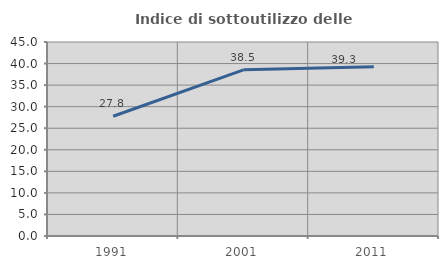
| Category | Indice di sottoutilizzo delle abitazioni  |
|---|---|
| 1991.0 | 27.778 |
| 2001.0 | 38.547 |
| 2011.0 | 39.286 |